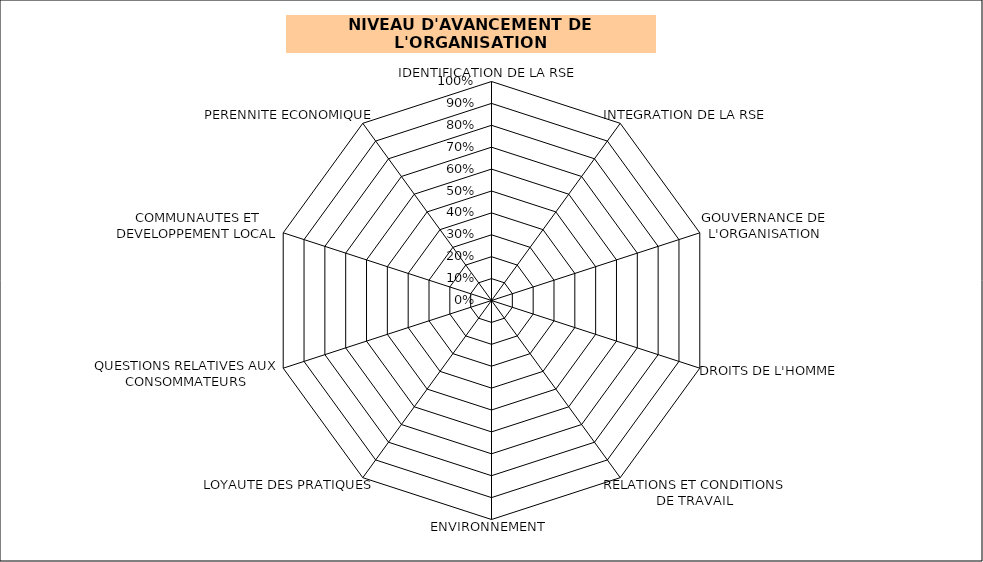
| Category | Series 0 |
|---|---|
| IDENTIFICATION DE LA RSE | 0 |
| INTEGRATION DE LA RSE | 0 |
| GOUVERNANCE DE L'ORGANISATION | 0 |
| DROITS DE L'HOMME | 0 |
| RELATIONS ET CONDITIONS DE TRAVAIL | 0 |
| ENVIRONNEMENT | 0 |
| LOYAUTE DES PRATIQUES | 0 |
| QUESTIONS RELATIVES AUX CONSOMMATEURS | 0 |
| COMMUNAUTES ET DEVELOPPEMENT LOCAL | 0 |
| PERENNITE ECONOMIQUE | 0 |